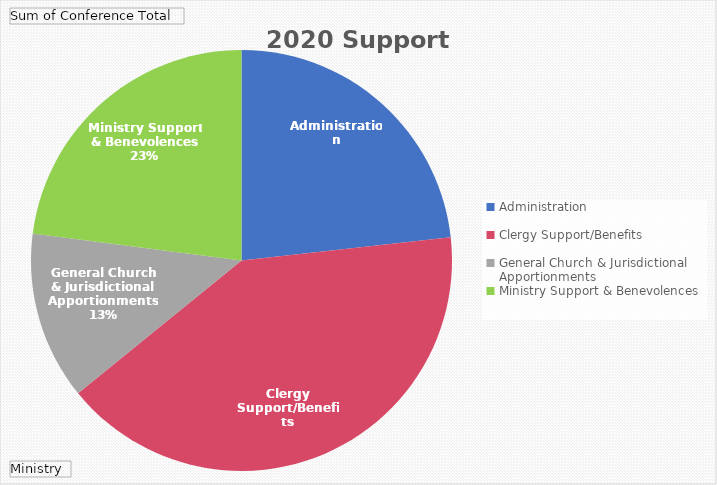
| Category | Total |
|---|---|
| Administration | 2993107 |
| Clergy Support/Benefits | 5267213 |
| General Church & Jurisdictional Apportionments | 1661484 |
| Ministry Support & Benevolences | 2955551 |